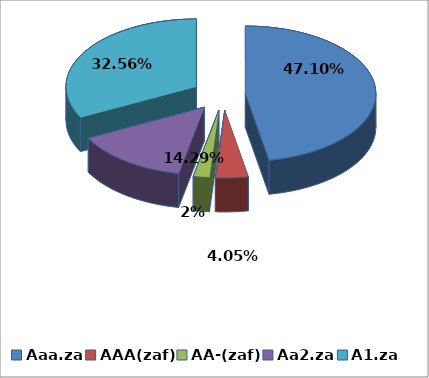
| Category | Series 0 |
|---|---|
| Aaa.za | 0.471 |
| AAA(zaf) | 0.04 |
| AA-(zaf) | 0.02 |
| Aa2.za | 0.143 |
| A1.za | 0.326 |